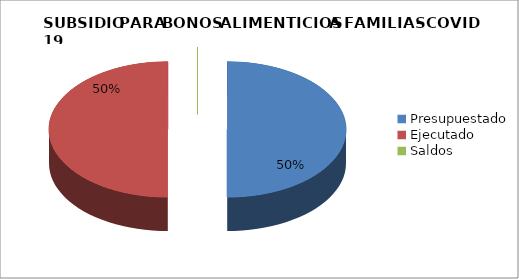
| Category | Series 0 |
|---|---|
| Presupuestado | 9556583906 |
| Ejecutado | 9556583906 |
| Saldos | 0 |